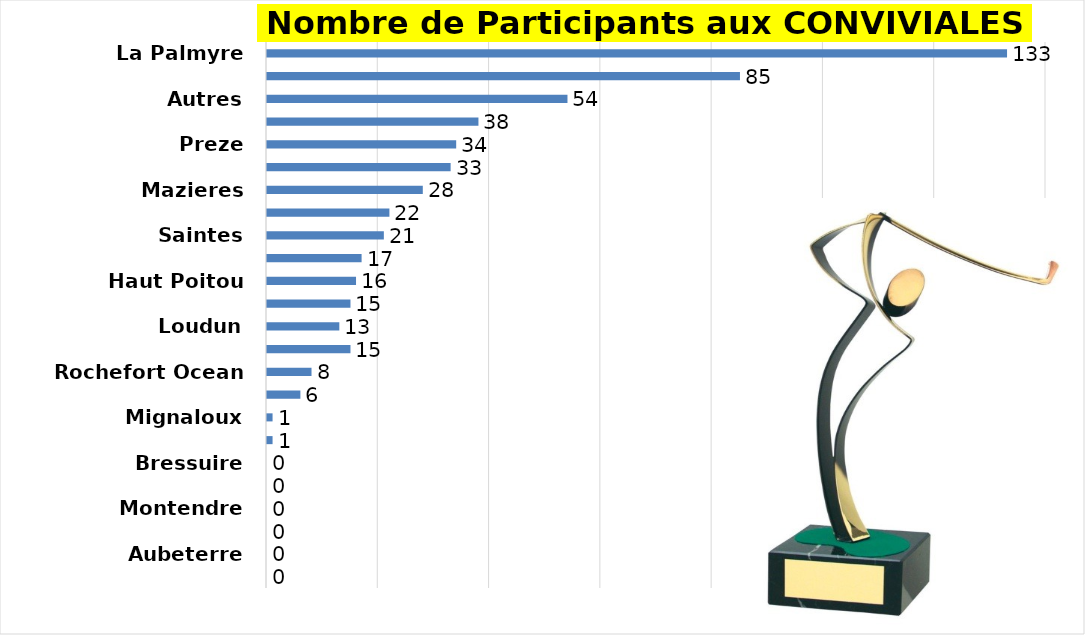
| Category | Series 0 |
|---|---|
| La Palmyre | 133 |
| Ch. Vallade | 85 |
| Autres | 54 |
| Angouleme Hiron | 38 |
| Preze | 34 |
| Niort | 33 |
| Mazieres | 28 |
| La Pree La Rochelle | 22 |
| Saintes | 21 |
| Roche Posay | 17 |
| Haut Poitou | 16 |
| Royan | 15 |
| Loudun | 13 |
| Rochelle Sud | 15 |
| Rochefort Ocean | 8 |
| Poitiers-Chalons | 6 |
| Mignaloux | 1 |
| Les Forges | 1 |
| Bressuire | 0 |
| Oleron | 0 |
| Montendre | 0 |
| Cognac | 0 |
| Aubeterre | 0 |
| La Domangere | 0 |